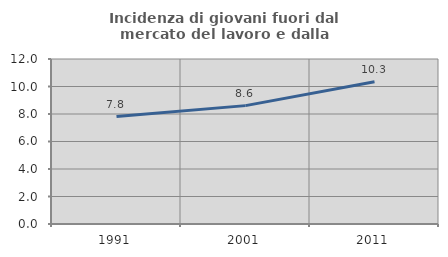
| Category | Incidenza di giovani fuori dal mercato del lavoro e dalla formazione  |
|---|---|
| 1991.0 | 7.812 |
| 2001.0 | 8.609 |
| 2011.0 | 10.345 |